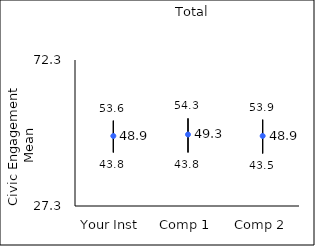
| Category | 25th percentile | 75th percentile | Mean |
|---|---|---|---|
| Your Inst | 43.8 | 53.6 | 48.88 |
| Comp 1 | 43.8 | 54.3 | 49.34 |
| Comp 2 | 43.5 | 53.9 | 48.89 |